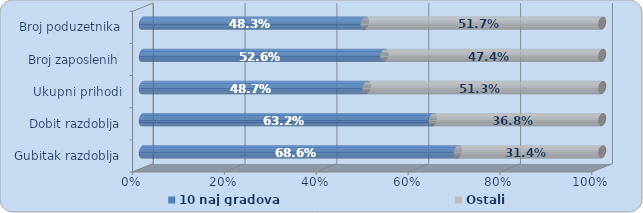
| Category | 10 naj gradova | Ostali |
|---|---|---|
| Gubitak razdoblja | 0.686 | 0.314 |
| Dobit razdoblja | 0.632 | 0.368 |
| Ukupni prihodi | 0.487 | 0.513 |
| Broj zaposlenih | 0.526 | 0.474 |
| Broj poduzetnika | 0.483 | 0.517 |